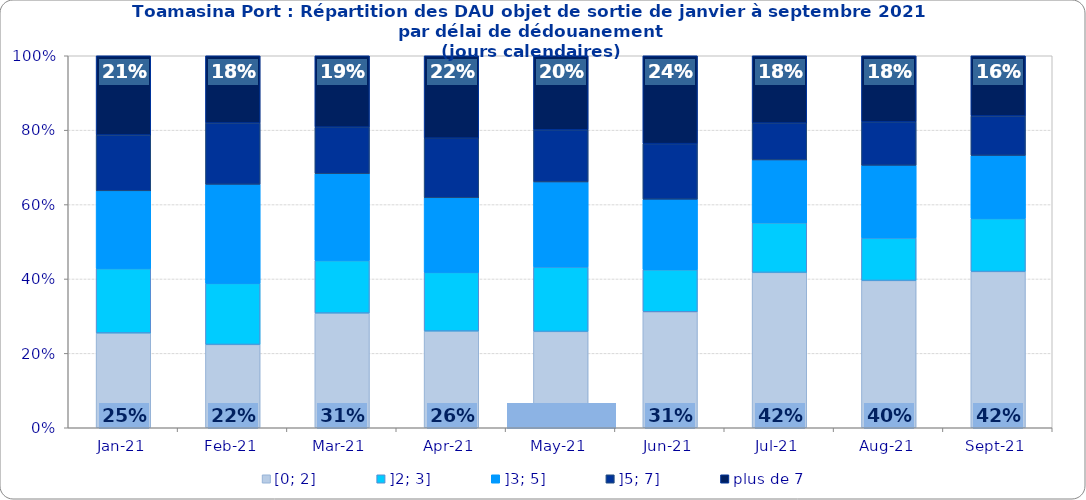
| Category | [0; 2] | ]2; 3] | ]3; 5] | ]5; 7] | plus de 7 |
|---|---|---|---|---|---|
| 2021-01-01 | 0.255 | 0.173 | 0.209 | 0.15 | 0.213 |
| 2021-02-01 | 0.224 | 0.164 | 0.266 | 0.165 | 0.181 |
| 2021-03-01 | 0.308 | 0.141 | 0.233 | 0.125 | 0.192 |
| 2021-04-01 | 0.26 | 0.158 | 0.201 | 0.16 | 0.221 |
| 2021-05-01 | 0.259 | 0.173 | 0.229 | 0.14 | 0.199 |
| 2021-06-01 | 0.312 | 0.113 | 0.19 | 0.149 | 0.236 |
| 2021-07-01 | 0.418 | 0.133 | 0.169 | 0.099 | 0.181 |
| 2021-08-01 | 0.396 | 0.114 | 0.195 | 0.117 | 0.178 |
| 2021-09-01 | 0.42 | 0.142 | 0.17 | 0.106 | 0.162 |